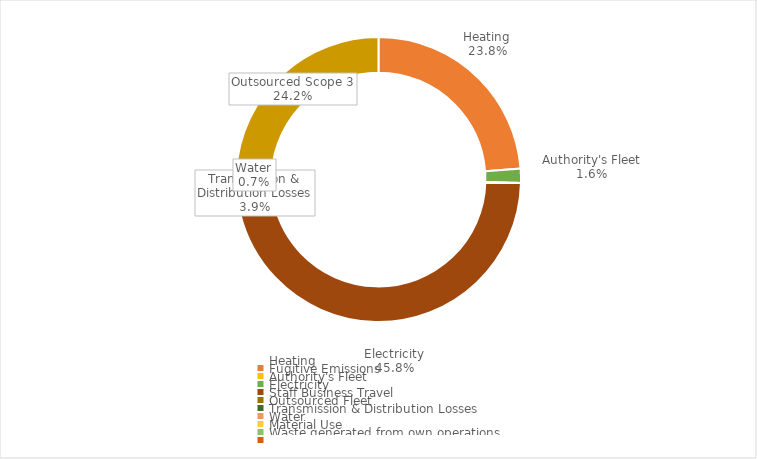
| Category | Emissions
(tCO2e) |
|---|---|
| Heating | 4001.695 |
| Fugitive Emissions | 0 |
| Authority's Fleet | 269.867 |
| Electricity | 7715.281 |
| Staff Business Travel | 0 |
| Outsourced Fleet | 0 |
| Transmission & Distribution Losses | 653.981 |
| Water | 118.162 |
| Material Use | 0 |
| Waste generated from own operations  | 0 |
| Outsourced Scope 3 | 4068.609 |